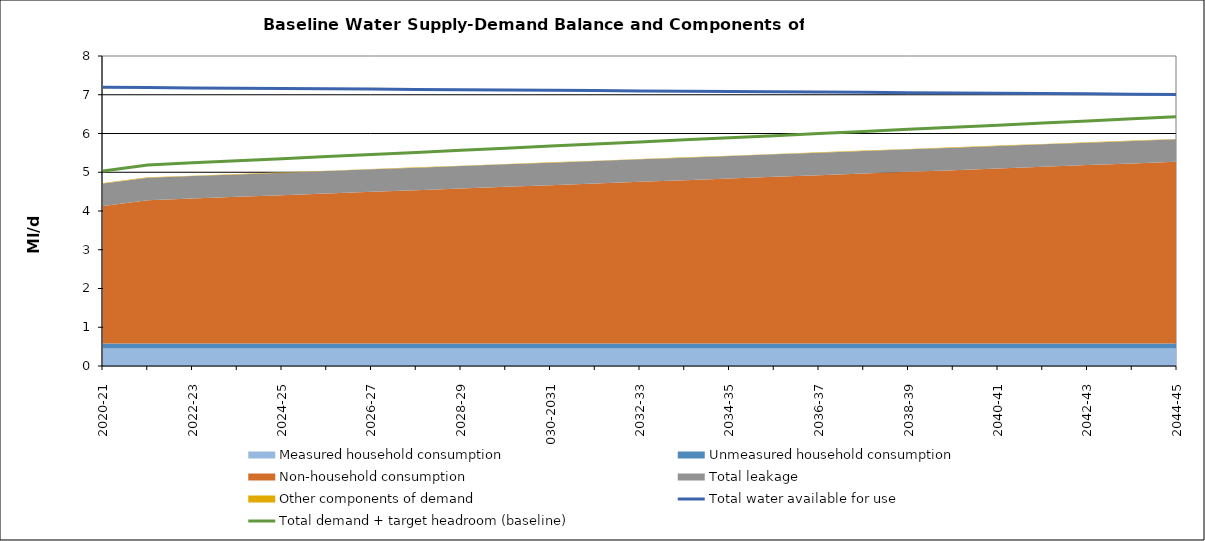
| Category | Total water available for use | Total demand + target headroom (baseline) |
|---|---|---|
| 0 | 7.192 | 5.03 |
| 1 | 7.185 | 5.188 |
| 2 | 7.177 | 5.242 |
| 3 | 7.169 | 5.296 |
| 4 | 7.162 | 5.35 |
| 5 | 7.154 | 5.404 |
| 6 | 7.146 | 5.458 |
| 7 | 7.138 | 5.512 |
| 8 | 7.131 | 5.567 |
| 9 | 7.123 | 5.621 |
| 10 | 7.115 | 5.675 |
| 11 | 7.108 | 5.729 |
| 12 | 7.1 | 5.783 |
| 13 | 7.092 | 5.837 |
| 14 | 7.085 | 5.891 |
| 15 | 7.077 | 5.945 |
| 16 | 7.069 | 5.999 |
| 17 | 7.061 | 6.053 |
| 18 | 7.054 | 6.107 |
| 19 | 7.046 | 6.161 |
| 20 | 7.038 | 6.215 |
| 21 | 7.031 | 6.27 |
| 22 | 7.023 | 6.324 |
| 23 | 7.015 | 6.378 |
| 24 | 7.008 | 6.432 |